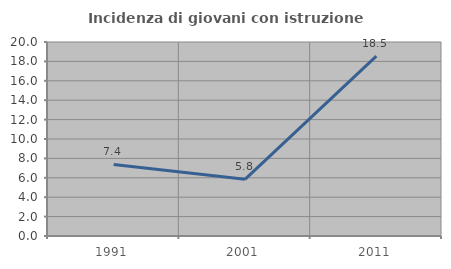
| Category | Incidenza di giovani con istruzione universitaria |
|---|---|
| 1991.0 | 7.38 |
| 2001.0 | 5.842 |
| 2011.0 | 18.543 |